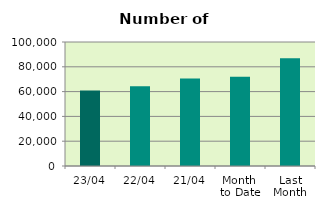
| Category | Series 0 |
|---|---|
| 23/04 | 60982 |
| 22/04 | 64414 |
| 21/04 | 70522 |
| Month 
to Date | 71934.267 |
| Last
Month | 86968.783 |